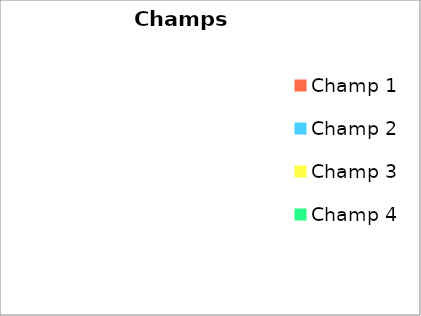
| Category | Decompte des champs |
|---|---|
| Champ 1 | 0 |
| Champ 2 | 0 |
| Champ 3 | 0 |
| Champ 4 | 0 |